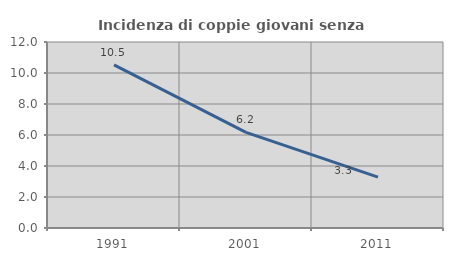
| Category | Incidenza di coppie giovani senza figli |
|---|---|
| 1991.0 | 10.523 |
| 2001.0 | 6.166 |
| 2011.0 | 3.283 |